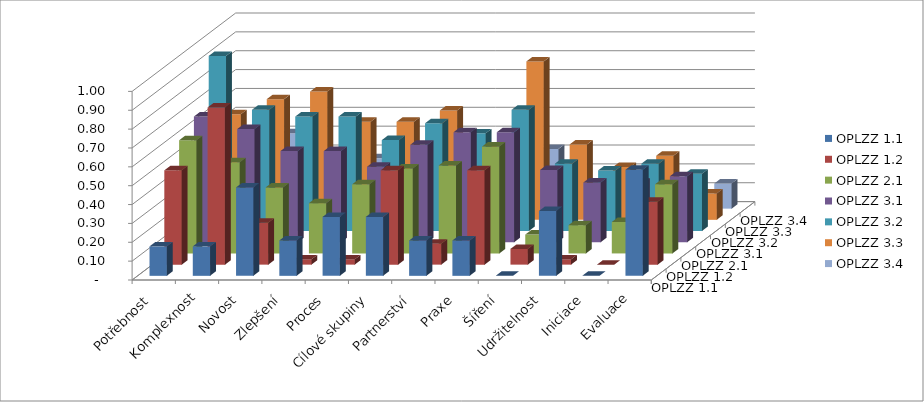
| Category | OPLZZ 1.1 | OPLZZ 1.2 | OPLZZ 2.1 | OPLZZ 3.1 | OPLZZ 3.2 | OPLZZ 3.3 | OPLZZ 3.4 |
|---|---|---|---|---|---|---|---|
| Potřebnost | 0.156 | 0.5 | 0.6 | 0.667 | 0.929 | 0.56 | 0.3 |
| Komplexnost | 0.156 | 0.833 | 0.483 | 0.6 | 0.643 | 0.64 | 0.4 |
| Novost | 0.469 | 0.222 | 0.35 | 0.483 | 0.607 | 0.68 | 0.267 |
| Zlepšení | 0.188 | 0.028 | 0.267 | 0.483 | 0.607 | 0.52 | 0.267 |
| Proces | 0.312 | 0.028 | 0.367 | 0.4 | 0.482 | 0.52 | 0.25 |
| Cílové skupiny | 0.312 | 0.5 | 0.45 | 0.517 | 0.571 | 0.58 | 0.25 |
| Partnerství | 0.188 | 0.111 | 0.467 | 0.583 | 0.518 | 0.38 | 0.317 |
| Praxe | 0.188 | 0.5 | 0.567 | 0.583 | 0.643 | 0.84 | 0.317 |
| Šíření | 0 | 0.083 | 0.1 | 0.383 | 0.357 | 0.4 | 0.133 |
| Udržitelnost | 0.344 | 0.028 | 0.15 | 0.317 | 0.321 | 0.28 | 0.1 |
| Iniciace | 0 | 0 | 0.167 | 0.317 | 0.357 | 0.34 | 0.133 |
| Evaluace | 0.562 | 0.333 | 0.367 | 0.35 | 0.304 | 0.14 | 0.133 |